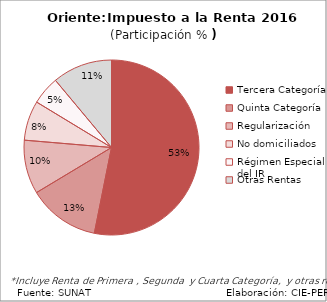
| Category | Series 0 |
|---|---|
| Tercera Categoría | 306.319 |
| Quinta Categoría | 76.312 |
| Regularización | 57.381 |
| No domiciliados | 42.293 |
| Régimen Especial del IR | 30.289 |
| Otras Rentas | 63.795 |